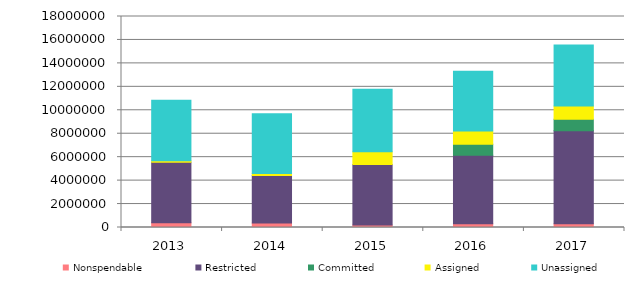
| Category |  Nonspendable  |  Restricted  |  Committed  |  Assigned  |  Unassigned  |
|---|---|---|---|---|---|
| 2013.0 | 411928 | 5155039 | 0 | 129398 | 5151361 |
| 2014.0 | 377249 | 4066214 | 0 | 166736 | 5089006 |
| 2015.0 | 220130 | 5144572 | 0 | 1104832 | 5333621 |
| 2016.0 | 317100 | 5836495 | 954071 | 1117773 | 5106154 |
| 2017.0 | 318102 | 7943412 | 979983 | 1118003 | 5209857 |